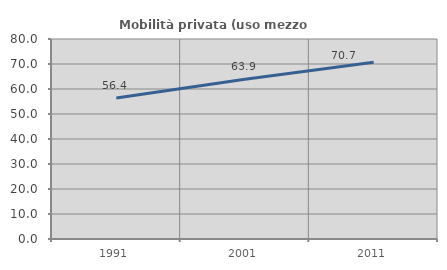
| Category | Mobilità privata (uso mezzo privato) |
|---|---|
| 1991.0 | 56.434 |
| 2001.0 | 63.905 |
| 2011.0 | 70.732 |